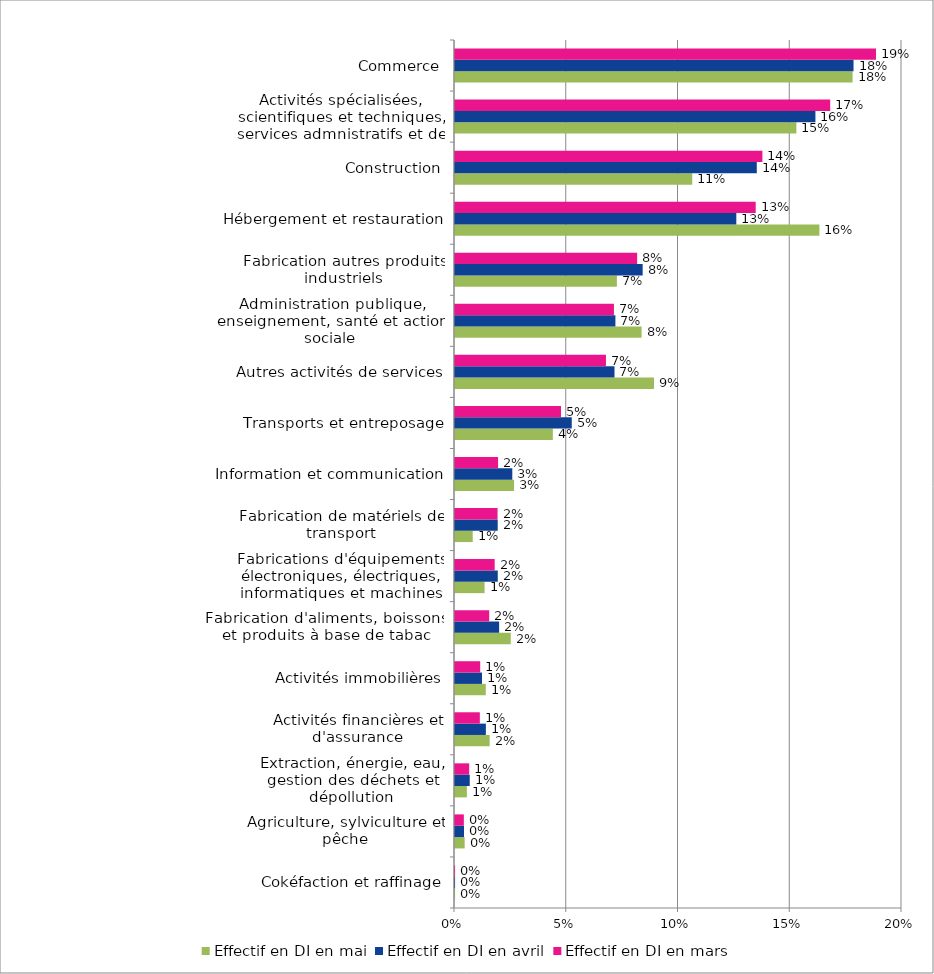
| Category | Effectif en DI en mai | Effectif en DI en avril | Effectif en DI en mars |
|---|---|---|---|
| Cokéfaction et raffinage | 0 | 0 | 0 |
| Agriculture, sylviculture et pêche | 0.004 | 0.004 | 0.004 |
| Extraction, énergie, eau, gestion des déchets et dépollution | 0.005 | 0.007 | 0.006 |
| Activités financières et d'assurance | 0.016 | 0.014 | 0.011 |
| Activités immobilières | 0.014 | 0.012 | 0.011 |
| Fabrication d'aliments, boissons et produits à base de tabac | 0.025 | 0.02 | 0.015 |
| Fabrications d'équipements électroniques, électriques, informatiques et machines | 0.013 | 0.019 | 0.018 |
| Fabrication de matériels de transport | 0.008 | 0.019 | 0.019 |
| Information et communication | 0.026 | 0.026 | 0.019 |
| Transports et entreposage | 0.044 | 0.052 | 0.047 |
| Autres activités de services | 0.089 | 0.071 | 0.068 |
| Administration publique, enseignement, santé et action sociale | 0.083 | 0.072 | 0.071 |
| Fabrication autres produits industriels | 0.072 | 0.084 | 0.081 |
| Hébergement et restauration | 0.163 | 0.126 | 0.135 |
| Construction | 0.106 | 0.135 | 0.138 |
| Activités spécialisées, scientifiques et techniques, services admnistratifs et de soutien | 0.153 | 0.161 | 0.168 |
| Commerce | 0.178 | 0.178 | 0.188 |